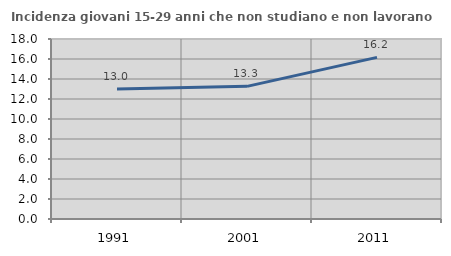
| Category | Incidenza giovani 15-29 anni che non studiano e non lavorano  |
|---|---|
| 1991.0 | 13.004 |
| 2001.0 | 13.264 |
| 2011.0 | 16.16 |